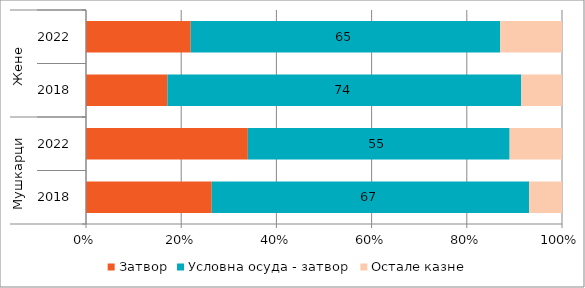
| Category | Затвор | Условна осуда - затвор | Остале казне  |
|---|---|---|---|
| 0 | 26.408 | 66.703 | 6.889 |
| 1 | 34 | 55 | 11 |
| 2 | 17.112 | 74.332 | 8.556 |
| 3 | 22 | 65 | 13 |